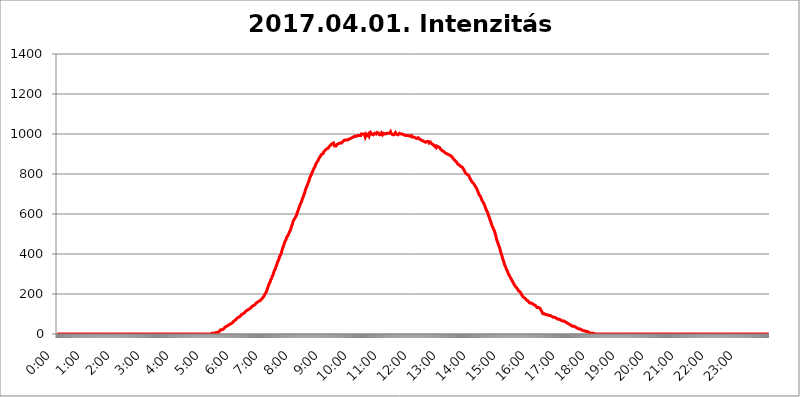
| Category | 2017.04.01. Intenzitás [W/m^2] |
|---|---|
| 0.0 | 0 |
| 0.0006944444444444445 | 0 |
| 0.001388888888888889 | 0 |
| 0.0020833333333333333 | 0 |
| 0.002777777777777778 | 0 |
| 0.003472222222222222 | 0 |
| 0.004166666666666667 | 0 |
| 0.004861111111111111 | 0 |
| 0.005555555555555556 | 0 |
| 0.0062499999999999995 | 0 |
| 0.006944444444444444 | 0 |
| 0.007638888888888889 | 0 |
| 0.008333333333333333 | 0 |
| 0.009027777777777779 | 0 |
| 0.009722222222222222 | 0 |
| 0.010416666666666666 | 0 |
| 0.011111111111111112 | 0 |
| 0.011805555555555555 | 0 |
| 0.012499999999999999 | 0 |
| 0.013194444444444444 | 0 |
| 0.013888888888888888 | 0 |
| 0.014583333333333332 | 0 |
| 0.015277777777777777 | 0 |
| 0.015972222222222224 | 0 |
| 0.016666666666666666 | 0 |
| 0.017361111111111112 | 0 |
| 0.018055555555555557 | 0 |
| 0.01875 | 0 |
| 0.019444444444444445 | 0 |
| 0.02013888888888889 | 0 |
| 0.020833333333333332 | 0 |
| 0.02152777777777778 | 0 |
| 0.022222222222222223 | 0 |
| 0.02291666666666667 | 0 |
| 0.02361111111111111 | 0 |
| 0.024305555555555556 | 0 |
| 0.024999999999999998 | 0 |
| 0.025694444444444447 | 0 |
| 0.02638888888888889 | 0 |
| 0.027083333333333334 | 0 |
| 0.027777777777777776 | 0 |
| 0.02847222222222222 | 0 |
| 0.029166666666666664 | 0 |
| 0.029861111111111113 | 0 |
| 0.030555555555555555 | 0 |
| 0.03125 | 0 |
| 0.03194444444444445 | 0 |
| 0.03263888888888889 | 0 |
| 0.03333333333333333 | 0 |
| 0.034027777777777775 | 0 |
| 0.034722222222222224 | 0 |
| 0.035416666666666666 | 0 |
| 0.036111111111111115 | 0 |
| 0.03680555555555556 | 0 |
| 0.0375 | 0 |
| 0.03819444444444444 | 0 |
| 0.03888888888888889 | 0 |
| 0.03958333333333333 | 0 |
| 0.04027777777777778 | 0 |
| 0.04097222222222222 | 0 |
| 0.041666666666666664 | 0 |
| 0.042361111111111106 | 0 |
| 0.04305555555555556 | 0 |
| 0.043750000000000004 | 0 |
| 0.044444444444444446 | 0 |
| 0.04513888888888889 | 0 |
| 0.04583333333333334 | 0 |
| 0.04652777777777778 | 0 |
| 0.04722222222222222 | 0 |
| 0.04791666666666666 | 0 |
| 0.04861111111111111 | 0 |
| 0.049305555555555554 | 0 |
| 0.049999999999999996 | 0 |
| 0.05069444444444445 | 0 |
| 0.051388888888888894 | 0 |
| 0.052083333333333336 | 0 |
| 0.05277777777777778 | 0 |
| 0.05347222222222222 | 0 |
| 0.05416666666666667 | 0 |
| 0.05486111111111111 | 0 |
| 0.05555555555555555 | 0 |
| 0.05625 | 0 |
| 0.05694444444444444 | 0 |
| 0.057638888888888885 | 0 |
| 0.05833333333333333 | 0 |
| 0.05902777777777778 | 0 |
| 0.059722222222222225 | 0 |
| 0.06041666666666667 | 0 |
| 0.061111111111111116 | 0 |
| 0.06180555555555556 | 0 |
| 0.0625 | 0 |
| 0.06319444444444444 | 0 |
| 0.06388888888888888 | 0 |
| 0.06458333333333334 | 0 |
| 0.06527777777777778 | 0 |
| 0.06597222222222222 | 0 |
| 0.06666666666666667 | 0 |
| 0.06736111111111111 | 0 |
| 0.06805555555555555 | 0 |
| 0.06874999999999999 | 0 |
| 0.06944444444444443 | 0 |
| 0.07013888888888889 | 0 |
| 0.07083333333333333 | 0 |
| 0.07152777777777779 | 0 |
| 0.07222222222222223 | 0 |
| 0.07291666666666667 | 0 |
| 0.07361111111111111 | 0 |
| 0.07430555555555556 | 0 |
| 0.075 | 0 |
| 0.07569444444444444 | 0 |
| 0.0763888888888889 | 0 |
| 0.07708333333333334 | 0 |
| 0.07777777777777778 | 0 |
| 0.07847222222222222 | 0 |
| 0.07916666666666666 | 0 |
| 0.0798611111111111 | 0 |
| 0.08055555555555556 | 0 |
| 0.08125 | 0 |
| 0.08194444444444444 | 0 |
| 0.08263888888888889 | 0 |
| 0.08333333333333333 | 0 |
| 0.08402777777777777 | 0 |
| 0.08472222222222221 | 0 |
| 0.08541666666666665 | 0 |
| 0.08611111111111112 | 0 |
| 0.08680555555555557 | 0 |
| 0.08750000000000001 | 0 |
| 0.08819444444444445 | 0 |
| 0.08888888888888889 | 0 |
| 0.08958333333333333 | 0 |
| 0.09027777777777778 | 0 |
| 0.09097222222222222 | 0 |
| 0.09166666666666667 | 0 |
| 0.09236111111111112 | 0 |
| 0.09305555555555556 | 0 |
| 0.09375 | 0 |
| 0.09444444444444444 | 0 |
| 0.09513888888888888 | 0 |
| 0.09583333333333333 | 0 |
| 0.09652777777777777 | 0 |
| 0.09722222222222222 | 0 |
| 0.09791666666666667 | 0 |
| 0.09861111111111111 | 0 |
| 0.09930555555555555 | 0 |
| 0.09999999999999999 | 0 |
| 0.10069444444444443 | 0 |
| 0.1013888888888889 | 0 |
| 0.10208333333333335 | 0 |
| 0.10277777777777779 | 0 |
| 0.10347222222222223 | 0 |
| 0.10416666666666667 | 0 |
| 0.10486111111111111 | 0 |
| 0.10555555555555556 | 0 |
| 0.10625 | 0 |
| 0.10694444444444444 | 0 |
| 0.1076388888888889 | 0 |
| 0.10833333333333334 | 0 |
| 0.10902777777777778 | 0 |
| 0.10972222222222222 | 0 |
| 0.1111111111111111 | 0 |
| 0.11180555555555556 | 0 |
| 0.11180555555555556 | 0 |
| 0.1125 | 0 |
| 0.11319444444444444 | 0 |
| 0.11388888888888889 | 0 |
| 0.11458333333333333 | 0 |
| 0.11527777777777777 | 0 |
| 0.11597222222222221 | 0 |
| 0.11666666666666665 | 0 |
| 0.1173611111111111 | 0 |
| 0.11805555555555557 | 0 |
| 0.11944444444444445 | 0 |
| 0.12013888888888889 | 0 |
| 0.12083333333333333 | 0 |
| 0.12152777777777778 | 0 |
| 0.12222222222222223 | 0 |
| 0.12291666666666667 | 0 |
| 0.12291666666666667 | 0 |
| 0.12361111111111112 | 0 |
| 0.12430555555555556 | 0 |
| 0.125 | 0 |
| 0.12569444444444444 | 0 |
| 0.12638888888888888 | 0 |
| 0.12708333333333333 | 0 |
| 0.16875 | 0 |
| 0.12847222222222224 | 0 |
| 0.12916666666666668 | 0 |
| 0.12986111111111112 | 0 |
| 0.13055555555555556 | 0 |
| 0.13125 | 0 |
| 0.13194444444444445 | 0 |
| 0.1326388888888889 | 0 |
| 0.13333333333333333 | 0 |
| 0.13402777777777777 | 0 |
| 0.13402777777777777 | 0 |
| 0.13472222222222222 | 0 |
| 0.13541666666666666 | 0 |
| 0.1361111111111111 | 0 |
| 0.13749999999999998 | 0 |
| 0.13819444444444443 | 0 |
| 0.1388888888888889 | 0 |
| 0.13958333333333334 | 0 |
| 0.14027777777777778 | 0 |
| 0.14097222222222222 | 0 |
| 0.14166666666666666 | 0 |
| 0.1423611111111111 | 0 |
| 0.14305555555555557 | 0 |
| 0.14375000000000002 | 0 |
| 0.14444444444444446 | 0 |
| 0.1451388888888889 | 0 |
| 0.1451388888888889 | 0 |
| 0.14652777777777778 | 0 |
| 0.14722222222222223 | 0 |
| 0.14791666666666667 | 0 |
| 0.1486111111111111 | 0 |
| 0.14930555555555555 | 0 |
| 0.15 | 0 |
| 0.15069444444444444 | 0 |
| 0.15138888888888888 | 0 |
| 0.15208333333333332 | 0 |
| 0.15277777777777776 | 0 |
| 0.15347222222222223 | 0 |
| 0.15416666666666667 | 0 |
| 0.15486111111111112 | 0 |
| 0.15555555555555556 | 0 |
| 0.15625 | 0 |
| 0.15694444444444444 | 0 |
| 0.15763888888888888 | 0 |
| 0.15833333333333333 | 0 |
| 0.15902777777777777 | 0 |
| 0.15972222222222224 | 0 |
| 0.16041666666666668 | 0 |
| 0.16111111111111112 | 0 |
| 0.16180555555555556 | 0 |
| 0.1625 | 0 |
| 0.16319444444444445 | 0 |
| 0.1638888888888889 | 0 |
| 0.16458333333333333 | 0 |
| 0.16527777777777777 | 0 |
| 0.16597222222222222 | 0 |
| 0.16666666666666666 | 0 |
| 0.1673611111111111 | 0 |
| 0.16805555555555554 | 0 |
| 0.16874999999999998 | 0 |
| 0.16944444444444443 | 0 |
| 0.17013888888888887 | 0 |
| 0.1708333333333333 | 0 |
| 0.17152777777777775 | 0 |
| 0.17222222222222225 | 0 |
| 0.1729166666666667 | 0 |
| 0.17361111111111113 | 0 |
| 0.17430555555555557 | 0 |
| 0.17500000000000002 | 0 |
| 0.17569444444444446 | 0 |
| 0.1763888888888889 | 0 |
| 0.17708333333333334 | 0 |
| 0.17777777777777778 | 0 |
| 0.17847222222222223 | 0 |
| 0.17916666666666667 | 0 |
| 0.1798611111111111 | 0 |
| 0.18055555555555555 | 0 |
| 0.18125 | 0 |
| 0.18194444444444444 | 0 |
| 0.1826388888888889 | 0 |
| 0.18333333333333335 | 0 |
| 0.1840277777777778 | 0 |
| 0.18472222222222223 | 0 |
| 0.18541666666666667 | 0 |
| 0.18611111111111112 | 0 |
| 0.18680555555555556 | 0 |
| 0.1875 | 0 |
| 0.18819444444444444 | 0 |
| 0.18888888888888888 | 0 |
| 0.18958333333333333 | 0 |
| 0.19027777777777777 | 0 |
| 0.1909722222222222 | 0 |
| 0.19166666666666665 | 0 |
| 0.19236111111111112 | 0 |
| 0.19305555555555554 | 0 |
| 0.19375 | 0 |
| 0.19444444444444445 | 0 |
| 0.1951388888888889 | 0 |
| 0.19583333333333333 | 0 |
| 0.19652777777777777 | 0 |
| 0.19722222222222222 | 0 |
| 0.19791666666666666 | 0 |
| 0.1986111111111111 | 0 |
| 0.19930555555555554 | 0 |
| 0.19999999999999998 | 0 |
| 0.20069444444444443 | 0 |
| 0.20138888888888887 | 0 |
| 0.2020833333333333 | 0 |
| 0.2027777777777778 | 0 |
| 0.2034722222222222 | 0 |
| 0.2041666666666667 | 0 |
| 0.20486111111111113 | 0 |
| 0.20555555555555557 | 0 |
| 0.20625000000000002 | 0 |
| 0.20694444444444446 | 0 |
| 0.2076388888888889 | 0 |
| 0.20833333333333334 | 0 |
| 0.20902777777777778 | 0 |
| 0.20972222222222223 | 0 |
| 0.21041666666666667 | 0 |
| 0.2111111111111111 | 0 |
| 0.21180555555555555 | 0 |
| 0.2125 | 0 |
| 0.21319444444444444 | 0 |
| 0.2138888888888889 | 0 |
| 0.21458333333333335 | 0 |
| 0.2152777777777778 | 0 |
| 0.21597222222222223 | 0 |
| 0.21666666666666667 | 3.525 |
| 0.21736111111111112 | 3.525 |
| 0.21805555555555556 | 3.525 |
| 0.21875 | 3.525 |
| 0.21944444444444444 | 3.525 |
| 0.22013888888888888 | 3.525 |
| 0.22083333333333333 | 3.525 |
| 0.22152777777777777 | 3.525 |
| 0.2222222222222222 | 7.887 |
| 0.22291666666666665 | 7.887 |
| 0.2236111111111111 | 7.887 |
| 0.22430555555555556 | 7.887 |
| 0.225 | 7.887 |
| 0.22569444444444445 | 12.257 |
| 0.2263888888888889 | 12.257 |
| 0.22708333333333333 | 12.257 |
| 0.22777777777777777 | 16.636 |
| 0.22847222222222222 | 16.636 |
| 0.22916666666666666 | 21.024 |
| 0.2298611111111111 | 21.024 |
| 0.23055555555555554 | 21.024 |
| 0.23124999999999998 | 21.024 |
| 0.23194444444444443 | 25.419 |
| 0.23263888888888887 | 25.419 |
| 0.2333333333333333 | 25.419 |
| 0.2340277777777778 | 29.823 |
| 0.2347222222222222 | 29.823 |
| 0.2354166666666667 | 34.234 |
| 0.23611111111111113 | 34.234 |
| 0.23680555555555557 | 34.234 |
| 0.23750000000000002 | 38.653 |
| 0.23819444444444446 | 38.653 |
| 0.2388888888888889 | 38.653 |
| 0.23958333333333334 | 43.079 |
| 0.24027777777777778 | 43.079 |
| 0.24097222222222223 | 47.511 |
| 0.24166666666666667 | 47.511 |
| 0.2423611111111111 | 47.511 |
| 0.24305555555555555 | 51.951 |
| 0.24375 | 51.951 |
| 0.24444444444444446 | 56.398 |
| 0.24513888888888888 | 56.398 |
| 0.24583333333333335 | 56.398 |
| 0.2465277777777778 | 60.85 |
| 0.24722222222222223 | 60.85 |
| 0.24791666666666667 | 65.31 |
| 0.24861111111111112 | 65.31 |
| 0.24930555555555556 | 69.775 |
| 0.25 | 69.775 |
| 0.25069444444444444 | 74.246 |
| 0.2513888888888889 | 74.246 |
| 0.2520833333333333 | 78.722 |
| 0.25277777777777777 | 78.722 |
| 0.2534722222222222 | 83.205 |
| 0.25416666666666665 | 83.205 |
| 0.2548611111111111 | 83.205 |
| 0.2555555555555556 | 87.692 |
| 0.25625000000000003 | 87.692 |
| 0.2569444444444445 | 92.184 |
| 0.2576388888888889 | 92.184 |
| 0.25833333333333336 | 96.682 |
| 0.2590277777777778 | 96.682 |
| 0.25972222222222224 | 101.184 |
| 0.2604166666666667 | 101.184 |
| 0.2611111111111111 | 101.184 |
| 0.26180555555555557 | 105.69 |
| 0.2625 | 105.69 |
| 0.26319444444444445 | 110.201 |
| 0.2638888888888889 | 110.201 |
| 0.26458333333333334 | 114.716 |
| 0.2652777777777778 | 114.716 |
| 0.2659722222222222 | 119.235 |
| 0.26666666666666666 | 119.235 |
| 0.2673611111111111 | 119.235 |
| 0.26805555555555555 | 123.758 |
| 0.26875 | 123.758 |
| 0.26944444444444443 | 128.284 |
| 0.2701388888888889 | 128.284 |
| 0.2708333333333333 | 128.284 |
| 0.27152777777777776 | 132.814 |
| 0.2722222222222222 | 132.814 |
| 0.27291666666666664 | 137.347 |
| 0.2736111111111111 | 137.347 |
| 0.2743055555555555 | 137.347 |
| 0.27499999999999997 | 141.884 |
| 0.27569444444444446 | 141.884 |
| 0.27638888888888885 | 146.423 |
| 0.27708333333333335 | 146.423 |
| 0.2777777777777778 | 150.964 |
| 0.27847222222222223 | 150.964 |
| 0.2791666666666667 | 155.509 |
| 0.2798611111111111 | 155.509 |
| 0.28055555555555556 | 155.509 |
| 0.28125 | 160.056 |
| 0.28194444444444444 | 160.056 |
| 0.2826388888888889 | 164.605 |
| 0.2833333333333333 | 164.605 |
| 0.28402777777777777 | 169.156 |
| 0.2847222222222222 | 169.156 |
| 0.28541666666666665 | 169.156 |
| 0.28611111111111115 | 173.709 |
| 0.28680555555555554 | 173.709 |
| 0.28750000000000003 | 178.264 |
| 0.2881944444444445 | 182.82 |
| 0.2888888888888889 | 182.82 |
| 0.28958333333333336 | 187.378 |
| 0.2902777777777778 | 191.937 |
| 0.29097222222222224 | 196.497 |
| 0.2916666666666667 | 201.058 |
| 0.2923611111111111 | 205.62 |
| 0.29305555555555557 | 210.182 |
| 0.29375 | 214.746 |
| 0.29444444444444445 | 223.873 |
| 0.2951388888888889 | 228.436 |
| 0.29583333333333334 | 237.564 |
| 0.2965277777777778 | 242.127 |
| 0.2972222222222222 | 251.251 |
| 0.29791666666666666 | 255.813 |
| 0.2986111111111111 | 260.373 |
| 0.29930555555555555 | 269.49 |
| 0.3 | 274.047 |
| 0.30069444444444443 | 278.603 |
| 0.3013888888888889 | 287.709 |
| 0.3020833333333333 | 292.259 |
| 0.30277777777777776 | 296.808 |
| 0.3034722222222222 | 305.898 |
| 0.30416666666666664 | 314.98 |
| 0.3048611111111111 | 319.517 |
| 0.3055555555555555 | 324.052 |
| 0.30624999999999997 | 328.584 |
| 0.3069444444444444 | 337.639 |
| 0.3076388888888889 | 342.162 |
| 0.30833333333333335 | 351.198 |
| 0.3090277777777778 | 360.221 |
| 0.30972222222222223 | 364.728 |
| 0.3104166666666667 | 369.23 |
| 0.3111111111111111 | 378.224 |
| 0.31180555555555556 | 382.715 |
| 0.3125 | 391.685 |
| 0.31319444444444444 | 396.164 |
| 0.3138888888888889 | 400.638 |
| 0.3145833333333333 | 409.574 |
| 0.31527777777777777 | 418.492 |
| 0.3159722222222222 | 427.39 |
| 0.31666666666666665 | 431.833 |
| 0.31736111111111115 | 440.702 |
| 0.31805555555555554 | 449.551 |
| 0.31875000000000003 | 453.968 |
| 0.3194444444444445 | 462.786 |
| 0.3201388888888889 | 467.187 |
| 0.32083333333333336 | 471.582 |
| 0.3215277777777778 | 480.356 |
| 0.32222222222222224 | 484.735 |
| 0.3229166666666667 | 489.108 |
| 0.3236111111111111 | 493.475 |
| 0.32430555555555557 | 497.836 |
| 0.325 | 502.192 |
| 0.32569444444444445 | 510.885 |
| 0.3263888888888889 | 515.223 |
| 0.32708333333333334 | 519.555 |
| 0.3277777777777778 | 523.88 |
| 0.3284722222222222 | 536.82 |
| 0.32916666666666666 | 541.121 |
| 0.3298611111111111 | 549.704 |
| 0.33055555555555555 | 562.53 |
| 0.33125 | 566.793 |
| 0.33194444444444443 | 571.049 |
| 0.3326388888888889 | 575.299 |
| 0.3333333333333333 | 579.542 |
| 0.3340277777777778 | 579.542 |
| 0.3347222222222222 | 583.779 |
| 0.3354166666666667 | 592.233 |
| 0.3361111111111111 | 600.661 |
| 0.3368055555555556 | 609.062 |
| 0.33749999999999997 | 613.252 |
| 0.33819444444444446 | 621.613 |
| 0.33888888888888885 | 629.948 |
| 0.33958333333333335 | 634.105 |
| 0.34027777777777773 | 642.4 |
| 0.34097222222222223 | 650.667 |
| 0.3416666666666666 | 654.791 |
| 0.3423611111111111 | 658.909 |
| 0.3430555555555555 | 667.123 |
| 0.34375 | 675.311 |
| 0.3444444444444445 | 679.395 |
| 0.3451388888888889 | 687.544 |
| 0.3458333333333334 | 695.666 |
| 0.34652777777777777 | 699.717 |
| 0.34722222222222227 | 707.8 |
| 0.34791666666666665 | 719.877 |
| 0.34861111111111115 | 723.889 |
| 0.34930555555555554 | 731.896 |
| 0.35000000000000003 | 735.89 |
| 0.3506944444444444 | 743.859 |
| 0.3513888888888889 | 751.803 |
| 0.3520833333333333 | 755.766 |
| 0.3527777777777778 | 763.674 |
| 0.3534722222222222 | 771.559 |
| 0.3541666666666667 | 779.42 |
| 0.3548611111111111 | 787.258 |
| 0.35555555555555557 | 791.169 |
| 0.35625 | 795.074 |
| 0.35694444444444445 | 802.868 |
| 0.3576388888888889 | 806.757 |
| 0.35833333333333334 | 814.519 |
| 0.3590277777777778 | 818.392 |
| 0.3597222222222222 | 826.123 |
| 0.36041666666666666 | 829.981 |
| 0.3611111111111111 | 833.834 |
| 0.36180555555555555 | 841.526 |
| 0.3625 | 845.365 |
| 0.36319444444444443 | 853.029 |
| 0.3638888888888889 | 856.855 |
| 0.3645833333333333 | 860.676 |
| 0.3652777777777778 | 864.493 |
| 0.3659722222222222 | 868.305 |
| 0.3666666666666667 | 875.918 |
| 0.3673611111111111 | 879.719 |
| 0.3680555555555556 | 883.516 |
| 0.36874999999999997 | 887.309 |
| 0.36944444444444446 | 891.099 |
| 0.37013888888888885 | 894.885 |
| 0.37083333333333335 | 898.668 |
| 0.37152777777777773 | 898.668 |
| 0.37222222222222223 | 902.447 |
| 0.3729166666666666 | 902.447 |
| 0.3736111111111111 | 909.996 |
| 0.3743055555555555 | 913.766 |
| 0.375 | 913.766 |
| 0.3756944444444445 | 917.534 |
| 0.3763888888888889 | 921.298 |
| 0.3770833333333334 | 921.298 |
| 0.37777777777777777 | 925.06 |
| 0.37847222222222227 | 925.06 |
| 0.37916666666666665 | 928.819 |
| 0.37986111111111115 | 928.819 |
| 0.38055555555555554 | 932.576 |
| 0.38125000000000003 | 936.33 |
| 0.3819444444444444 | 940.082 |
| 0.3826388888888889 | 940.082 |
| 0.3833333333333333 | 943.832 |
| 0.3840277777777778 | 943.832 |
| 0.3847222222222222 | 947.58 |
| 0.3854166666666667 | 951.327 |
| 0.3861111111111111 | 955.071 |
| 0.38680555555555557 | 955.071 |
| 0.3875 | 955.071 |
| 0.38819444444444445 | 947.58 |
| 0.3888888888888889 | 940.082 |
| 0.38958333333333334 | 936.33 |
| 0.3902777777777778 | 936.33 |
| 0.3909722222222222 | 940.082 |
| 0.39166666666666666 | 943.832 |
| 0.3923611111111111 | 947.58 |
| 0.39305555555555555 | 947.58 |
| 0.39375 | 947.58 |
| 0.39444444444444443 | 951.327 |
| 0.3951388888888889 | 951.327 |
| 0.3958333333333333 | 951.327 |
| 0.3965277777777778 | 955.071 |
| 0.3972222222222222 | 955.071 |
| 0.3979166666666667 | 955.071 |
| 0.3986111111111111 | 955.071 |
| 0.3993055555555556 | 955.071 |
| 0.39999999999999997 | 958.814 |
| 0.40069444444444446 | 962.555 |
| 0.40138888888888885 | 962.555 |
| 0.40208333333333335 | 966.295 |
| 0.40277777777777773 | 970.034 |
| 0.40347222222222223 | 970.034 |
| 0.4041666666666666 | 970.034 |
| 0.4048611111111111 | 970.034 |
| 0.4055555555555555 | 970.034 |
| 0.40625 | 970.034 |
| 0.4069444444444445 | 970.034 |
| 0.4076388888888889 | 970.034 |
| 0.4083333333333334 | 970.034 |
| 0.40902777777777777 | 973.772 |
| 0.40972222222222227 | 977.508 |
| 0.41041666666666665 | 977.508 |
| 0.41111111111111115 | 977.508 |
| 0.41180555555555554 | 977.508 |
| 0.41250000000000003 | 977.508 |
| 0.4131944444444444 | 981.244 |
| 0.4138888888888889 | 981.244 |
| 0.4145833333333333 | 984.98 |
| 0.4152777777777778 | 984.98 |
| 0.4159722222222222 | 984.98 |
| 0.4166666666666667 | 984.98 |
| 0.4173611111111111 | 988.714 |
| 0.41805555555555557 | 984.98 |
| 0.41875 | 988.714 |
| 0.41944444444444445 | 988.714 |
| 0.4201388888888889 | 988.714 |
| 0.42083333333333334 | 988.714 |
| 0.4215277777777778 | 992.448 |
| 0.4222222222222222 | 992.448 |
| 0.42291666666666666 | 992.448 |
| 0.4236111111111111 | 992.448 |
| 0.42430555555555555 | 992.448 |
| 0.425 | 996.182 |
| 0.42569444444444443 | 992.448 |
| 0.4263888888888889 | 999.916 |
| 0.4270833333333333 | 996.182 |
| 0.4277777777777778 | 996.182 |
| 0.4284722222222222 | 999.916 |
| 0.4291666666666667 | 996.182 |
| 0.4298611111111111 | 999.916 |
| 0.4305555555555556 | 999.916 |
| 0.43124999999999997 | 992.448 |
| 0.43194444444444446 | 1003.65 |
| 0.43263888888888885 | 992.448 |
| 0.43333333333333335 | 999.916 |
| 0.43402777777777773 | 1003.65 |
| 0.43472222222222223 | 1003.65 |
| 0.4354166666666666 | 992.448 |
| 0.4361111111111111 | 992.448 |
| 0.4368055555555555 | 999.916 |
| 0.4375 | 992.448 |
| 0.4381944444444445 | 999.916 |
| 0.4388888888888889 | 999.916 |
| 0.4395833333333334 | 1007.383 |
| 0.44027777777777777 | 1003.65 |
| 0.44097222222222227 | 999.916 |
| 0.44166666666666665 | 1003.65 |
| 0.44236111111111115 | 999.916 |
| 0.44305555555555554 | 996.182 |
| 0.44375000000000003 | 996.182 |
| 0.4444444444444444 | 999.916 |
| 0.4451388888888889 | 1003.65 |
| 0.4458333333333333 | 1003.65 |
| 0.4465277777777778 | 1007.383 |
| 0.4472222222222222 | 999.916 |
| 0.4479166666666667 | 999.916 |
| 0.4486111111111111 | 1007.383 |
| 0.44930555555555557 | 1003.65 |
| 0.45 | 1003.65 |
| 0.45069444444444445 | 1003.65 |
| 0.4513888888888889 | 999.916 |
| 0.45208333333333334 | 996.182 |
| 0.4527777777777778 | 996.182 |
| 0.4534722222222222 | 992.448 |
| 0.45416666666666666 | 996.182 |
| 0.4548611111111111 | 1003.65 |
| 0.45555555555555555 | 999.916 |
| 0.45625 | 996.182 |
| 0.45694444444444443 | 992.448 |
| 0.4576388888888889 | 1003.65 |
| 0.4583333333333333 | 1003.65 |
| 0.4590277777777778 | 999.916 |
| 0.4597222222222222 | 999.916 |
| 0.4604166666666667 | 999.916 |
| 0.4611111111111111 | 999.916 |
| 0.4618055555555556 | 1003.65 |
| 0.46249999999999997 | 1003.65 |
| 0.46319444444444446 | 1007.383 |
| 0.46388888888888885 | 1003.65 |
| 0.46458333333333335 | 999.916 |
| 0.46527777777777773 | 999.916 |
| 0.46597222222222223 | 1003.65 |
| 0.4666666666666666 | 1003.65 |
| 0.4673611111111111 | 1011.118 |
| 0.4680555555555555 | 1003.65 |
| 0.46875 | 1007.383 |
| 0.4694444444444445 | 999.916 |
| 0.4701388888888889 | 996.182 |
| 0.4708333333333334 | 996.182 |
| 0.47152777777777777 | 996.182 |
| 0.47222222222222227 | 996.182 |
| 0.47291666666666665 | 999.916 |
| 0.47361111111111115 | 999.916 |
| 0.47430555555555554 | 1007.383 |
| 0.47500000000000003 | 1003.65 |
| 0.4756944444444444 | 999.916 |
| 0.4763888888888889 | 996.182 |
| 0.4770833333333333 | 996.182 |
| 0.4777777777777778 | 996.182 |
| 0.4784722222222222 | 999.916 |
| 0.4791666666666667 | 999.916 |
| 0.4798611111111111 | 1003.65 |
| 0.48055555555555557 | 1003.65 |
| 0.48125 | 1003.65 |
| 0.48194444444444445 | 999.916 |
| 0.4826388888888889 | 999.916 |
| 0.48333333333333334 | 999.916 |
| 0.4840277777777778 | 999.916 |
| 0.4847222222222222 | 999.916 |
| 0.48541666666666666 | 996.182 |
| 0.4861111111111111 | 996.182 |
| 0.48680555555555555 | 996.182 |
| 0.4875 | 992.448 |
| 0.48819444444444443 | 992.448 |
| 0.4888888888888889 | 996.182 |
| 0.4895833333333333 | 992.448 |
| 0.4902777777777778 | 992.448 |
| 0.4909722222222222 | 992.448 |
| 0.4916666666666667 | 992.448 |
| 0.4923611111111111 | 992.448 |
| 0.4930555555555556 | 992.448 |
| 0.49374999999999997 | 992.448 |
| 0.49444444444444446 | 988.714 |
| 0.49513888888888885 | 992.448 |
| 0.49583333333333335 | 992.448 |
| 0.49652777777777773 | 992.448 |
| 0.49722222222222223 | 988.714 |
| 0.4979166666666666 | 984.98 |
| 0.4986111111111111 | 984.98 |
| 0.4993055555555555 | 984.98 |
| 0.5 | 984.98 |
| 0.5006944444444444 | 984.98 |
| 0.5013888888888889 | 981.244 |
| 0.5020833333333333 | 981.244 |
| 0.5027777777777778 | 981.244 |
| 0.5034722222222222 | 981.244 |
| 0.5041666666666667 | 977.508 |
| 0.5048611111111111 | 977.508 |
| 0.5055555555555555 | 977.508 |
| 0.50625 | 981.244 |
| 0.5069444444444444 | 977.508 |
| 0.5076388888888889 | 977.508 |
| 0.5083333333333333 | 973.772 |
| 0.5090277777777777 | 973.772 |
| 0.5097222222222222 | 973.772 |
| 0.5104166666666666 | 970.034 |
| 0.5111111111111112 | 970.034 |
| 0.5118055555555555 | 966.295 |
| 0.5125000000000001 | 966.295 |
| 0.5131944444444444 | 966.295 |
| 0.513888888888889 | 962.555 |
| 0.5145833333333333 | 962.555 |
| 0.5152777777777778 | 962.555 |
| 0.5159722222222222 | 958.814 |
| 0.5166666666666667 | 958.814 |
| 0.517361111111111 | 962.555 |
| 0.5180555555555556 | 962.555 |
| 0.5187499999999999 | 962.555 |
| 0.5194444444444445 | 962.555 |
| 0.5201388888888888 | 958.814 |
| 0.5208333333333334 | 962.555 |
| 0.5215277777777778 | 955.071 |
| 0.5222222222222223 | 955.071 |
| 0.5229166666666667 | 958.814 |
| 0.5236111111111111 | 958.814 |
| 0.5243055555555556 | 958.814 |
| 0.525 | 951.327 |
| 0.5256944444444445 | 947.58 |
| 0.5263888888888889 | 947.58 |
| 0.5270833333333333 | 947.58 |
| 0.5277777777777778 | 943.832 |
| 0.5284722222222222 | 943.832 |
| 0.5291666666666667 | 940.082 |
| 0.5298611111111111 | 943.832 |
| 0.5305555555555556 | 936.33 |
| 0.53125 | 932.576 |
| 0.5319444444444444 | 940.082 |
| 0.5326388888888889 | 936.33 |
| 0.5333333333333333 | 936.33 |
| 0.5340277777777778 | 936.33 |
| 0.5347222222222222 | 936.33 |
| 0.5354166666666667 | 932.576 |
| 0.5361111111111111 | 932.576 |
| 0.5368055555555555 | 928.819 |
| 0.5375 | 925.06 |
| 0.5381944444444444 | 925.06 |
| 0.5388888888888889 | 925.06 |
| 0.5395833333333333 | 917.534 |
| 0.5402777777777777 | 917.534 |
| 0.5409722222222222 | 913.766 |
| 0.5416666666666666 | 913.766 |
| 0.5423611111111112 | 909.996 |
| 0.5430555555555555 | 909.996 |
| 0.5437500000000001 | 906.223 |
| 0.5444444444444444 | 906.223 |
| 0.545138888888889 | 902.447 |
| 0.5458333333333333 | 902.447 |
| 0.5465277777777778 | 898.668 |
| 0.5472222222222222 | 898.668 |
| 0.5479166666666667 | 898.668 |
| 0.548611111111111 | 898.668 |
| 0.5493055555555556 | 898.668 |
| 0.5499999999999999 | 894.885 |
| 0.5506944444444445 | 894.885 |
| 0.5513888888888888 | 894.885 |
| 0.5520833333333334 | 891.099 |
| 0.5527777777777778 | 891.099 |
| 0.5534722222222223 | 887.309 |
| 0.5541666666666667 | 883.516 |
| 0.5548611111111111 | 879.719 |
| 0.5555555555555556 | 875.918 |
| 0.55625 | 875.918 |
| 0.5569444444444445 | 872.114 |
| 0.5576388888888889 | 868.305 |
| 0.5583333333333333 | 864.493 |
| 0.5590277777777778 | 864.493 |
| 0.5597222222222222 | 860.676 |
| 0.5604166666666667 | 856.855 |
| 0.5611111111111111 | 856.855 |
| 0.5618055555555556 | 849.199 |
| 0.5625 | 849.199 |
| 0.5631944444444444 | 849.199 |
| 0.5638888888888889 | 845.365 |
| 0.5645833333333333 | 845.365 |
| 0.5652777777777778 | 841.526 |
| 0.5659722222222222 | 837.682 |
| 0.5666666666666667 | 837.682 |
| 0.5673611111111111 | 837.682 |
| 0.5680555555555555 | 833.834 |
| 0.56875 | 829.981 |
| 0.5694444444444444 | 826.123 |
| 0.5701388888888889 | 822.26 |
| 0.5708333333333333 | 818.392 |
| 0.5715277777777777 | 814.519 |
| 0.5722222222222222 | 806.757 |
| 0.5729166666666666 | 806.757 |
| 0.5736111111111112 | 802.868 |
| 0.5743055555555555 | 798.974 |
| 0.5750000000000001 | 795.074 |
| 0.5756944444444444 | 798.974 |
| 0.576388888888889 | 795.074 |
| 0.5770833333333333 | 791.169 |
| 0.5777777777777778 | 787.258 |
| 0.5784722222222222 | 783.342 |
| 0.5791666666666667 | 775.492 |
| 0.579861111111111 | 771.559 |
| 0.5805555555555556 | 767.62 |
| 0.5812499999999999 | 763.674 |
| 0.5819444444444445 | 759.723 |
| 0.5826388888888888 | 759.723 |
| 0.5833333333333334 | 759.723 |
| 0.5840277777777778 | 751.803 |
| 0.5847222222222223 | 747.834 |
| 0.5854166666666667 | 743.859 |
| 0.5861111111111111 | 739.877 |
| 0.5868055555555556 | 735.89 |
| 0.5875 | 731.896 |
| 0.5881944444444445 | 727.896 |
| 0.5888888888888889 | 723.889 |
| 0.5895833333333333 | 715.858 |
| 0.5902777777777778 | 711.832 |
| 0.5909722222222222 | 703.762 |
| 0.5916666666666667 | 695.666 |
| 0.5923611111111111 | 691.608 |
| 0.5930555555555556 | 691.608 |
| 0.59375 | 687.544 |
| 0.5944444444444444 | 679.395 |
| 0.5951388888888889 | 675.311 |
| 0.5958333333333333 | 667.123 |
| 0.5965277777777778 | 663.019 |
| 0.5972222222222222 | 658.909 |
| 0.5979166666666667 | 654.791 |
| 0.5986111111111111 | 650.667 |
| 0.5993055555555555 | 646.537 |
| 0.6 | 638.256 |
| 0.6006944444444444 | 629.948 |
| 0.6013888888888889 | 625.784 |
| 0.6020833333333333 | 617.436 |
| 0.6027777777777777 | 613.252 |
| 0.6034722222222222 | 609.062 |
| 0.6041666666666666 | 600.661 |
| 0.6048611111111112 | 592.233 |
| 0.6055555555555555 | 588.009 |
| 0.6062500000000001 | 579.542 |
| 0.6069444444444444 | 571.049 |
| 0.607638888888889 | 566.793 |
| 0.6083333333333333 | 558.261 |
| 0.6090277777777778 | 549.704 |
| 0.6097222222222222 | 541.121 |
| 0.6104166666666667 | 536.82 |
| 0.611111111111111 | 532.513 |
| 0.6118055555555556 | 523.88 |
| 0.6124999999999999 | 519.555 |
| 0.6131944444444445 | 515.223 |
| 0.6138888888888888 | 506.542 |
| 0.6145833333333334 | 497.836 |
| 0.6152777777777778 | 489.108 |
| 0.6159722222222223 | 475.972 |
| 0.6166666666666667 | 467.187 |
| 0.6173611111111111 | 462.786 |
| 0.6180555555555556 | 453.968 |
| 0.61875 | 449.551 |
| 0.6194444444444445 | 440.702 |
| 0.6201388888888889 | 436.27 |
| 0.6208333333333333 | 427.39 |
| 0.6215277777777778 | 414.035 |
| 0.6222222222222222 | 409.574 |
| 0.6229166666666667 | 400.638 |
| 0.6236111111111111 | 391.685 |
| 0.6243055555555556 | 382.715 |
| 0.625 | 373.729 |
| 0.6256944444444444 | 369.23 |
| 0.6263888888888889 | 360.221 |
| 0.6270833333333333 | 355.712 |
| 0.6277777777777778 | 342.162 |
| 0.6284722222222222 | 337.639 |
| 0.6291666666666667 | 333.113 |
| 0.6298611111111111 | 324.052 |
| 0.6305555555555555 | 319.517 |
| 0.63125 | 314.98 |
| 0.6319444444444444 | 310.44 |
| 0.6326388888888889 | 301.354 |
| 0.6333333333333333 | 296.808 |
| 0.6340277777777777 | 292.259 |
| 0.6347222222222222 | 287.709 |
| 0.6354166666666666 | 283.156 |
| 0.6361111111111112 | 278.603 |
| 0.6368055555555555 | 274.047 |
| 0.6375000000000001 | 269.49 |
| 0.6381944444444444 | 264.932 |
| 0.638888888888889 | 260.373 |
| 0.6395833333333333 | 260.373 |
| 0.6402777777777778 | 251.251 |
| 0.6409722222222222 | 246.689 |
| 0.6416666666666667 | 242.127 |
| 0.642361111111111 | 242.127 |
| 0.6430555555555556 | 237.564 |
| 0.6437499999999999 | 233 |
| 0.6444444444444445 | 233 |
| 0.6451388888888888 | 228.436 |
| 0.6458333333333334 | 223.873 |
| 0.6465277777777778 | 219.309 |
| 0.6472222222222223 | 214.746 |
| 0.6479166666666667 | 214.746 |
| 0.6486111111111111 | 210.182 |
| 0.6493055555555556 | 210.182 |
| 0.65 | 205.62 |
| 0.6506944444444445 | 201.058 |
| 0.6513888888888889 | 196.497 |
| 0.6520833333333333 | 191.937 |
| 0.6527777777777778 | 191.937 |
| 0.6534722222222222 | 187.378 |
| 0.6541666666666667 | 182.82 |
| 0.6548611111111111 | 182.82 |
| 0.6555555555555556 | 178.264 |
| 0.65625 | 178.264 |
| 0.6569444444444444 | 173.709 |
| 0.6576388888888889 | 173.709 |
| 0.6583333333333333 | 169.156 |
| 0.6590277777777778 | 164.605 |
| 0.6597222222222222 | 164.605 |
| 0.6604166666666667 | 164.605 |
| 0.6611111111111111 | 164.605 |
| 0.6618055555555555 | 160.056 |
| 0.6625 | 155.509 |
| 0.6631944444444444 | 155.509 |
| 0.6638888888888889 | 155.509 |
| 0.6645833333333333 | 155.509 |
| 0.6652777777777777 | 150.964 |
| 0.6659722222222222 | 150.964 |
| 0.6666666666666666 | 150.964 |
| 0.6673611111111111 | 146.423 |
| 0.6680555555555556 | 146.423 |
| 0.6687500000000001 | 146.423 |
| 0.6694444444444444 | 146.423 |
| 0.6701388888888888 | 141.884 |
| 0.6708333333333334 | 141.884 |
| 0.6715277777777778 | 137.347 |
| 0.6722222222222222 | 137.347 |
| 0.6729166666666666 | 132.814 |
| 0.6736111111111112 | 132.814 |
| 0.6743055555555556 | 132.814 |
| 0.6749999999999999 | 132.814 |
| 0.6756944444444444 | 128.284 |
| 0.6763888888888889 | 128.284 |
| 0.6770833333333334 | 128.284 |
| 0.6777777777777777 | 123.758 |
| 0.6784722222222223 | 119.235 |
| 0.6791666666666667 | 114.716 |
| 0.6798611111111111 | 110.201 |
| 0.6805555555555555 | 105.69 |
| 0.68125 | 101.184 |
| 0.6819444444444445 | 101.184 |
| 0.6826388888888889 | 101.184 |
| 0.6833333333333332 | 101.184 |
| 0.6840277777777778 | 96.682 |
| 0.6847222222222222 | 96.682 |
| 0.6854166666666667 | 96.682 |
| 0.686111111111111 | 96.682 |
| 0.6868055555555556 | 96.682 |
| 0.6875 | 96.682 |
| 0.6881944444444444 | 92.184 |
| 0.688888888888889 | 92.184 |
| 0.6895833333333333 | 92.184 |
| 0.6902777777777778 | 92.184 |
| 0.6909722222222222 | 92.184 |
| 0.6916666666666668 | 92.184 |
| 0.6923611111111111 | 87.692 |
| 0.6930555555555555 | 87.692 |
| 0.69375 | 87.692 |
| 0.6944444444444445 | 87.692 |
| 0.6951388888888889 | 87.692 |
| 0.6958333333333333 | 83.205 |
| 0.6965277777777777 | 83.205 |
| 0.6972222222222223 | 83.205 |
| 0.6979166666666666 | 83.205 |
| 0.6986111111111111 | 83.205 |
| 0.6993055555555556 | 83.205 |
| 0.7000000000000001 | 78.722 |
| 0.7006944444444444 | 78.722 |
| 0.7013888888888888 | 78.722 |
| 0.7020833333333334 | 74.246 |
| 0.7027777777777778 | 74.246 |
| 0.7034722222222222 | 74.246 |
| 0.7041666666666666 | 74.246 |
| 0.7048611111111112 | 74.246 |
| 0.7055555555555556 | 69.775 |
| 0.7062499999999999 | 69.775 |
| 0.7069444444444444 | 69.775 |
| 0.7076388888888889 | 69.775 |
| 0.7083333333333334 | 65.31 |
| 0.7090277777777777 | 65.31 |
| 0.7097222222222223 | 65.31 |
| 0.7104166666666667 | 65.31 |
| 0.7111111111111111 | 60.85 |
| 0.7118055555555555 | 60.85 |
| 0.7125 | 60.85 |
| 0.7131944444444445 | 56.398 |
| 0.7138888888888889 | 56.398 |
| 0.7145833333333332 | 56.398 |
| 0.7152777777777778 | 51.951 |
| 0.7159722222222222 | 51.951 |
| 0.7166666666666667 | 51.951 |
| 0.717361111111111 | 47.511 |
| 0.7180555555555556 | 47.511 |
| 0.71875 | 47.511 |
| 0.7194444444444444 | 47.511 |
| 0.720138888888889 | 43.079 |
| 0.7208333333333333 | 43.079 |
| 0.7215277777777778 | 43.079 |
| 0.7222222222222222 | 38.653 |
| 0.7229166666666668 | 38.653 |
| 0.7236111111111111 | 38.653 |
| 0.7243055555555555 | 38.653 |
| 0.725 | 38.653 |
| 0.7256944444444445 | 34.234 |
| 0.7263888888888889 | 34.234 |
| 0.7270833333333333 | 34.234 |
| 0.7277777777777777 | 29.823 |
| 0.7284722222222223 | 29.823 |
| 0.7291666666666666 | 29.823 |
| 0.7298611111111111 | 29.823 |
| 0.7305555555555556 | 29.823 |
| 0.7312500000000001 | 25.419 |
| 0.7319444444444444 | 25.419 |
| 0.7326388888888888 | 25.419 |
| 0.7333333333333334 | 25.419 |
| 0.7340277777777778 | 21.024 |
| 0.7347222222222222 | 21.024 |
| 0.7354166666666666 | 21.024 |
| 0.7361111111111112 | 21.024 |
| 0.7368055555555556 | 21.024 |
| 0.7374999999999999 | 16.636 |
| 0.7381944444444444 | 16.636 |
| 0.7388888888888889 | 16.636 |
| 0.7395833333333334 | 16.636 |
| 0.7402777777777777 | 16.636 |
| 0.7409722222222223 | 12.257 |
| 0.7416666666666667 | 12.257 |
| 0.7423611111111111 | 12.257 |
| 0.7430555555555555 | 12.257 |
| 0.74375 | 12.257 |
| 0.7444444444444445 | 7.887 |
| 0.7451388888888889 | 7.887 |
| 0.7458333333333332 | 7.887 |
| 0.7465277777777778 | 7.887 |
| 0.7472222222222222 | 7.887 |
| 0.7479166666666667 | 3.525 |
| 0.748611111111111 | 3.525 |
| 0.7493055555555556 | 3.525 |
| 0.75 | 3.525 |
| 0.7506944444444444 | 3.525 |
| 0.751388888888889 | 3.525 |
| 0.7520833333333333 | 3.525 |
| 0.7527777777777778 | 0 |
| 0.7534722222222222 | 0 |
| 0.7541666666666668 | 0 |
| 0.7548611111111111 | 0 |
| 0.7555555555555555 | 0 |
| 0.75625 | 0 |
| 0.7569444444444445 | 0 |
| 0.7576388888888889 | 0 |
| 0.7583333333333333 | 0 |
| 0.7590277777777777 | 0 |
| 0.7597222222222223 | 0 |
| 0.7604166666666666 | 0 |
| 0.7611111111111111 | 0 |
| 0.7618055555555556 | 0 |
| 0.7625000000000001 | 0 |
| 0.7631944444444444 | 0 |
| 0.7638888888888888 | 0 |
| 0.7645833333333334 | 0 |
| 0.7652777777777778 | 0 |
| 0.7659722222222222 | 0 |
| 0.7666666666666666 | 0 |
| 0.7673611111111112 | 0 |
| 0.7680555555555556 | 0 |
| 0.7687499999999999 | 0 |
| 0.7694444444444444 | 0 |
| 0.7701388888888889 | 0 |
| 0.7708333333333334 | 0 |
| 0.7715277777777777 | 0 |
| 0.7722222222222223 | 0 |
| 0.7729166666666667 | 0 |
| 0.7736111111111111 | 0 |
| 0.7743055555555555 | 0 |
| 0.775 | 0 |
| 0.7756944444444445 | 0 |
| 0.7763888888888889 | 0 |
| 0.7770833333333332 | 0 |
| 0.7777777777777778 | 0 |
| 0.7784722222222222 | 0 |
| 0.7791666666666667 | 0 |
| 0.779861111111111 | 0 |
| 0.7805555555555556 | 0 |
| 0.78125 | 0 |
| 0.7819444444444444 | 0 |
| 0.782638888888889 | 0 |
| 0.7833333333333333 | 0 |
| 0.7840277777777778 | 0 |
| 0.7847222222222222 | 0 |
| 0.7854166666666668 | 0 |
| 0.7861111111111111 | 0 |
| 0.7868055555555555 | 0 |
| 0.7875 | 0 |
| 0.7881944444444445 | 0 |
| 0.7888888888888889 | 0 |
| 0.7895833333333333 | 0 |
| 0.7902777777777777 | 0 |
| 0.7909722222222223 | 0 |
| 0.7916666666666666 | 0 |
| 0.7923611111111111 | 0 |
| 0.7930555555555556 | 0 |
| 0.7937500000000001 | 0 |
| 0.7944444444444444 | 0 |
| 0.7951388888888888 | 0 |
| 0.7958333333333334 | 0 |
| 0.7965277777777778 | 0 |
| 0.7972222222222222 | 0 |
| 0.7979166666666666 | 0 |
| 0.7986111111111112 | 0 |
| 0.7993055555555556 | 0 |
| 0.7999999999999999 | 0 |
| 0.8006944444444444 | 0 |
| 0.8013888888888889 | 0 |
| 0.8020833333333334 | 0 |
| 0.8027777777777777 | 0 |
| 0.8034722222222223 | 0 |
| 0.8041666666666667 | 0 |
| 0.8048611111111111 | 0 |
| 0.8055555555555555 | 0 |
| 0.80625 | 0 |
| 0.8069444444444445 | 0 |
| 0.8076388888888889 | 0 |
| 0.8083333333333332 | 0 |
| 0.8090277777777778 | 0 |
| 0.8097222222222222 | 0 |
| 0.8104166666666667 | 0 |
| 0.811111111111111 | 0 |
| 0.8118055555555556 | 0 |
| 0.8125 | 0 |
| 0.8131944444444444 | 0 |
| 0.813888888888889 | 0 |
| 0.8145833333333333 | 0 |
| 0.8152777777777778 | 0 |
| 0.8159722222222222 | 0 |
| 0.8166666666666668 | 0 |
| 0.8173611111111111 | 0 |
| 0.8180555555555555 | 0 |
| 0.81875 | 0 |
| 0.8194444444444445 | 0 |
| 0.8201388888888889 | 0 |
| 0.8208333333333333 | 0 |
| 0.8215277777777777 | 0 |
| 0.8222222222222223 | 0 |
| 0.8229166666666666 | 0 |
| 0.8236111111111111 | 0 |
| 0.8243055555555556 | 0 |
| 0.8250000000000001 | 0 |
| 0.8256944444444444 | 0 |
| 0.8263888888888888 | 0 |
| 0.8270833333333334 | 0 |
| 0.8277777777777778 | 0 |
| 0.8284722222222222 | 0 |
| 0.8291666666666666 | 0 |
| 0.8298611111111112 | 0 |
| 0.8305555555555556 | 0 |
| 0.8312499999999999 | 0 |
| 0.8319444444444444 | 0 |
| 0.8326388888888889 | 0 |
| 0.8333333333333334 | 0 |
| 0.8340277777777777 | 0 |
| 0.8347222222222223 | 0 |
| 0.8354166666666667 | 0 |
| 0.8361111111111111 | 0 |
| 0.8368055555555555 | 0 |
| 0.8375 | 0 |
| 0.8381944444444445 | 0 |
| 0.8388888888888889 | 0 |
| 0.8395833333333332 | 0 |
| 0.8402777777777778 | 0 |
| 0.8409722222222222 | 0 |
| 0.8416666666666667 | 0 |
| 0.842361111111111 | 0 |
| 0.8430555555555556 | 0 |
| 0.84375 | 0 |
| 0.8444444444444444 | 0 |
| 0.845138888888889 | 0 |
| 0.8458333333333333 | 0 |
| 0.8465277777777778 | 0 |
| 0.8472222222222222 | 0 |
| 0.8479166666666668 | 0 |
| 0.8486111111111111 | 0 |
| 0.8493055555555555 | 0 |
| 0.85 | 0 |
| 0.8506944444444445 | 0 |
| 0.8513888888888889 | 0 |
| 0.8520833333333333 | 0 |
| 0.8527777777777777 | 0 |
| 0.8534722222222223 | 0 |
| 0.8541666666666666 | 0 |
| 0.8548611111111111 | 0 |
| 0.8555555555555556 | 0 |
| 0.8562500000000001 | 0 |
| 0.8569444444444444 | 0 |
| 0.8576388888888888 | 0 |
| 0.8583333333333334 | 0 |
| 0.8590277777777778 | 0 |
| 0.8597222222222222 | 0 |
| 0.8604166666666666 | 0 |
| 0.8611111111111112 | 0 |
| 0.8618055555555556 | 0 |
| 0.8624999999999999 | 0 |
| 0.8631944444444444 | 0 |
| 0.8638888888888889 | 0 |
| 0.8645833333333334 | 0 |
| 0.8652777777777777 | 0 |
| 0.8659722222222223 | 0 |
| 0.8666666666666667 | 0 |
| 0.8673611111111111 | 0 |
| 0.8680555555555555 | 0 |
| 0.86875 | 0 |
| 0.8694444444444445 | 0 |
| 0.8701388888888889 | 0 |
| 0.8708333333333332 | 0 |
| 0.8715277777777778 | 0 |
| 0.8722222222222222 | 0 |
| 0.8729166666666667 | 0 |
| 0.873611111111111 | 0 |
| 0.8743055555555556 | 0 |
| 0.875 | 0 |
| 0.8756944444444444 | 0 |
| 0.876388888888889 | 0 |
| 0.8770833333333333 | 0 |
| 0.8777777777777778 | 0 |
| 0.8784722222222222 | 0 |
| 0.8791666666666668 | 0 |
| 0.8798611111111111 | 0 |
| 0.8805555555555555 | 0 |
| 0.88125 | 0 |
| 0.8819444444444445 | 0 |
| 0.8826388888888889 | 0 |
| 0.8833333333333333 | 0 |
| 0.8840277777777777 | 0 |
| 0.8847222222222223 | 0 |
| 0.8854166666666666 | 0 |
| 0.8861111111111111 | 0 |
| 0.8868055555555556 | 0 |
| 0.8875000000000001 | 0 |
| 0.8881944444444444 | 0 |
| 0.8888888888888888 | 0 |
| 0.8895833333333334 | 0 |
| 0.8902777777777778 | 0 |
| 0.8909722222222222 | 0 |
| 0.8916666666666666 | 0 |
| 0.8923611111111112 | 0 |
| 0.8930555555555556 | 0 |
| 0.8937499999999999 | 0 |
| 0.8944444444444444 | 0 |
| 0.8951388888888889 | 0 |
| 0.8958333333333334 | 0 |
| 0.8965277777777777 | 0 |
| 0.8972222222222223 | 0 |
| 0.8979166666666667 | 0 |
| 0.8986111111111111 | 0 |
| 0.8993055555555555 | 0 |
| 0.9 | 0 |
| 0.9006944444444445 | 0 |
| 0.9013888888888889 | 0 |
| 0.9020833333333332 | 0 |
| 0.9027777777777778 | 0 |
| 0.9034722222222222 | 0 |
| 0.9041666666666667 | 0 |
| 0.904861111111111 | 0 |
| 0.9055555555555556 | 0 |
| 0.90625 | 0 |
| 0.9069444444444444 | 0 |
| 0.907638888888889 | 0 |
| 0.9083333333333333 | 0 |
| 0.9090277777777778 | 0 |
| 0.9097222222222222 | 0 |
| 0.9104166666666668 | 0 |
| 0.9111111111111111 | 0 |
| 0.9118055555555555 | 0 |
| 0.9125 | 0 |
| 0.9131944444444445 | 0 |
| 0.9138888888888889 | 0 |
| 0.9145833333333333 | 0 |
| 0.9152777777777777 | 0 |
| 0.9159722222222223 | 0 |
| 0.9166666666666666 | 0 |
| 0.9173611111111111 | 0 |
| 0.9180555555555556 | 0 |
| 0.9187500000000001 | 0 |
| 0.9194444444444444 | 0 |
| 0.9201388888888888 | 0 |
| 0.9208333333333334 | 0 |
| 0.9215277777777778 | 0 |
| 0.9222222222222222 | 0 |
| 0.9229166666666666 | 0 |
| 0.9236111111111112 | 0 |
| 0.9243055555555556 | 0 |
| 0.9249999999999999 | 0 |
| 0.9256944444444444 | 0 |
| 0.9263888888888889 | 0 |
| 0.9270833333333334 | 0 |
| 0.9277777777777777 | 0 |
| 0.9284722222222223 | 0 |
| 0.9291666666666667 | 0 |
| 0.9298611111111111 | 0 |
| 0.9305555555555555 | 0 |
| 0.93125 | 0 |
| 0.9319444444444445 | 0 |
| 0.9326388888888889 | 0 |
| 0.9333333333333332 | 0 |
| 0.9340277777777778 | 0 |
| 0.9347222222222222 | 0 |
| 0.9354166666666667 | 0 |
| 0.936111111111111 | 0 |
| 0.9368055555555556 | 0 |
| 0.9375 | 0 |
| 0.9381944444444444 | 0 |
| 0.938888888888889 | 0 |
| 0.9395833333333333 | 0 |
| 0.9402777777777778 | 0 |
| 0.9409722222222222 | 0 |
| 0.9416666666666668 | 0 |
| 0.9423611111111111 | 0 |
| 0.9430555555555555 | 0 |
| 0.94375 | 0 |
| 0.9444444444444445 | 0 |
| 0.9451388888888889 | 0 |
| 0.9458333333333333 | 0 |
| 0.9465277777777777 | 0 |
| 0.9472222222222223 | 0 |
| 0.9479166666666666 | 0 |
| 0.9486111111111111 | 0 |
| 0.9493055555555556 | 0 |
| 0.9500000000000001 | 0 |
| 0.9506944444444444 | 0 |
| 0.9513888888888888 | 0 |
| 0.9520833333333334 | 0 |
| 0.9527777777777778 | 0 |
| 0.9534722222222222 | 0 |
| 0.9541666666666666 | 0 |
| 0.9548611111111112 | 0 |
| 0.9555555555555556 | 0 |
| 0.9562499999999999 | 0 |
| 0.9569444444444444 | 0 |
| 0.9576388888888889 | 0 |
| 0.9583333333333334 | 0 |
| 0.9590277777777777 | 0 |
| 0.9597222222222223 | 0 |
| 0.9604166666666667 | 0 |
| 0.9611111111111111 | 0 |
| 0.9618055555555555 | 0 |
| 0.9625 | 0 |
| 0.9631944444444445 | 0 |
| 0.9638888888888889 | 0 |
| 0.9645833333333332 | 0 |
| 0.9652777777777778 | 0 |
| 0.9659722222222222 | 0 |
| 0.9666666666666667 | 0 |
| 0.967361111111111 | 0 |
| 0.9680555555555556 | 0 |
| 0.96875 | 0 |
| 0.9694444444444444 | 0 |
| 0.970138888888889 | 0 |
| 0.9708333333333333 | 0 |
| 0.9715277777777778 | 0 |
| 0.9722222222222222 | 0 |
| 0.9729166666666668 | 0 |
| 0.9736111111111111 | 0 |
| 0.9743055555555555 | 0 |
| 0.975 | 0 |
| 0.9756944444444445 | 0 |
| 0.9763888888888889 | 0 |
| 0.9770833333333333 | 0 |
| 0.9777777777777777 | 0 |
| 0.9784722222222223 | 0 |
| 0.9791666666666666 | 0 |
| 0.9798611111111111 | 0 |
| 0.9805555555555556 | 0 |
| 0.9812500000000001 | 0 |
| 0.9819444444444444 | 0 |
| 0.9826388888888888 | 0 |
| 0.9833333333333334 | 0 |
| 0.9840277777777778 | 0 |
| 0.9847222222222222 | 0 |
| 0.9854166666666666 | 0 |
| 0.9861111111111112 | 0 |
| 0.9868055555555556 | 0 |
| 0.9874999999999999 | 0 |
| 0.9881944444444444 | 0 |
| 0.9888888888888889 | 0 |
| 0.9895833333333334 | 0 |
| 0.9902777777777777 | 0 |
| 0.9909722222222223 | 0 |
| 0.9916666666666667 | 0 |
| 0.9923611111111111 | 0 |
| 0.9930555555555555 | 0 |
| 0.99375 | 0 |
| 0.9944444444444445 | 0 |
| 0.9951388888888889 | 0 |
| 0.9958333333333332 | 0 |
| 0.9965277777777778 | 0 |
| 0.9972222222222222 | 0 |
| 0.9979166666666667 | 0 |
| 0.998611111111111 | 0 |
| 0.9993055555555556 | 0 |